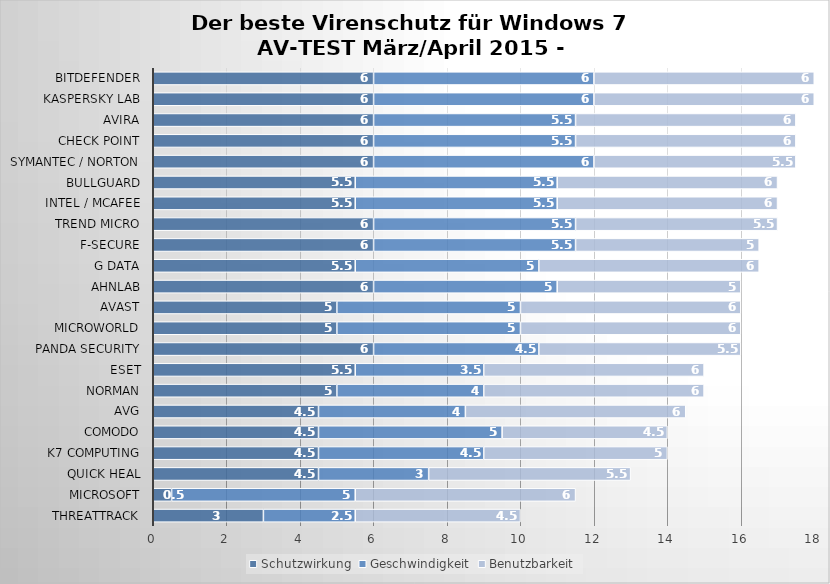
| Category | Schutzwirkung | Geschwindigkeit | Benutzbarkeit |
|---|---|---|---|
| ThreatTrack | 3 | 2.5 | 4.5 |
| Microsoft | 0.5 | 5 | 6 |
| Quick Heal | 4.5 | 3 | 5.5 |
| K7 Computing | 4.5 | 4.5 | 5 |
| Comodo | 4.5 | 5 | 4.5 |
| AVG | 4.5 | 4 | 6 |
| Norman | 5 | 4 | 6 |
| ESET | 5.5 | 3.5 | 6 |
| Panda Security | 6 | 4.5 | 5.5 |
| Microworld | 5 | 5 | 6 |
| Avast | 5 | 5 | 6 |
| AhnLab | 6 | 5 | 5 |
| G Data | 5.5 | 5 | 6 |
| F-Secure | 6 | 5.5 | 5 |
| Trend Micro | 6 | 5.5 | 5.5 |
| Intel / McAfee | 5.5 | 5.5 | 6 |
| BullGuard | 5.5 | 5.5 | 6 |
| Symantec / Norton | 6 | 6 | 5.5 |
| Check Point | 6 | 5.5 | 6 |
| Avira | 6 | 5.5 | 6 |
| Kaspersky Lab | 6 | 6 | 6 |
| Bitdefender | 6 | 6 | 6 |